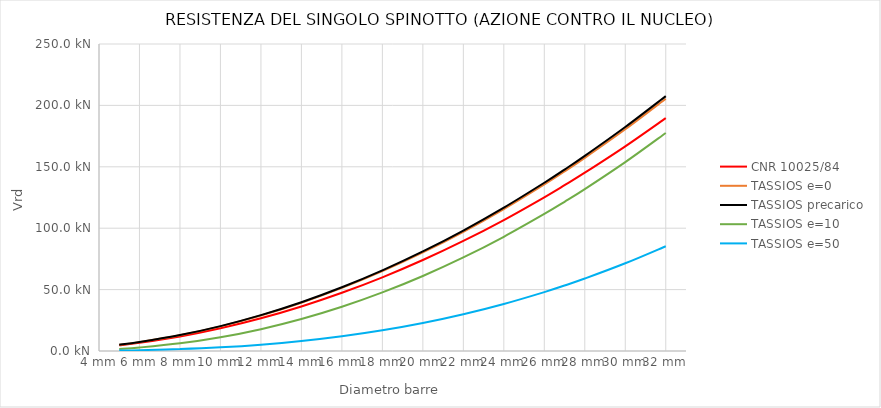
| Category | Series 3 |
|---|---|
| 0 | 0 |